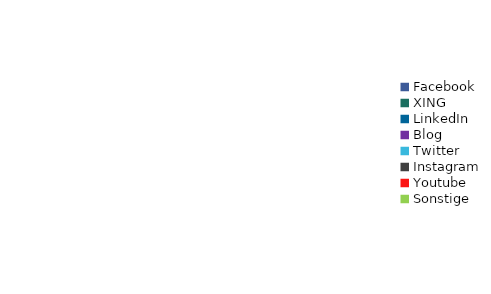
| Category | Series 0 |
|---|---|
| Facebook | 0 |
| XING | 0 |
| LinkedIn | 0 |
| Blog | 0 |
| Twitter | 0 |
| Instagram | 0 |
| Youtube | 0 |
| Sonstige | 0 |